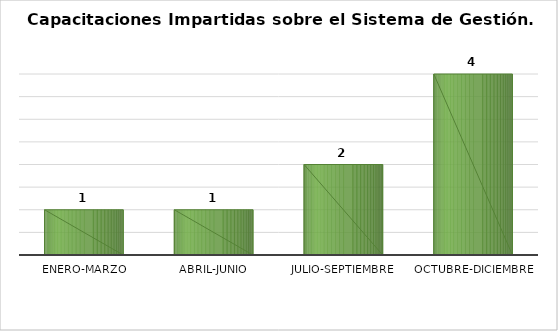
| Category | Capacitaciones impartidas/1 |
|---|---|
| Enero-Marzo | 1 |
| Abril-Junio | 1 |
| Julio-Septiembre | 2 |
| Octubre-Diciembre | 4 |